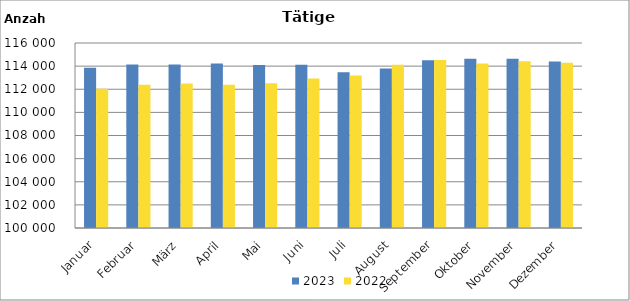
| Category | 2023 | 2022 |
|---|---|---|
| Januar | 113851 | 112044 |
| Februar | 114137 | 112388 |
| März | 114148 | 112487 |
| April | 114223 | 112387 |
| Mai | 114104 | 112529 |
| Juni | 114114 | 112923 |
| Juli | 113464 | 113191 |
| August | 113786 | 114109 |
| September | 114510 | 114539 |
| Oktober | 114639 | 114233 |
| November | 114629 | 114415 |
| Dezember | 114399 | 114291 |